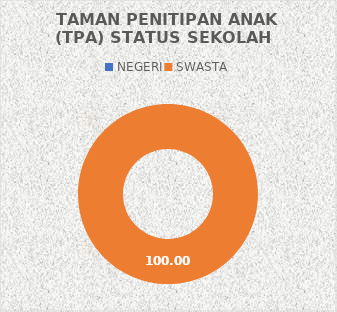
| Category | TAMAN PENITIPAN ANAK (TPA) STATUS SEKOLAH |
|---|---|
| NEGERI | 0 |
| SWASTA | 37 |